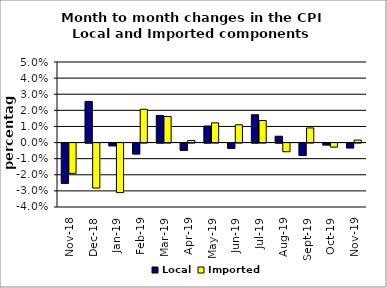
| Category | Local | Imported |
|---|---|---|
| 2018-11-01 | -0.025 | -0.019 |
| 2018-12-01 | 0.026 | -0.028 |
| 2019-01-01 | -0.002 | -0.031 |
| 2019-02-01 | -0.007 | 0.021 |
| 2019-03-01 | 0.017 | 0.016 |
| 2019-04-01 | -0.005 | 0.001 |
| 2019-05-01 | 0.01 | 0.012 |
| 2019-06-01 | -0.003 | 0.011 |
| 2019-07-01 | 0.017 | 0.014 |
| 2019-08-01 | 0.004 | -0.005 |
| 2019-09-01 | -0.008 | 0.009 |
| 2019-10-01 | -0.001 | -0.003 |
| 2019-11-01 | -0.003 | 0.002 |